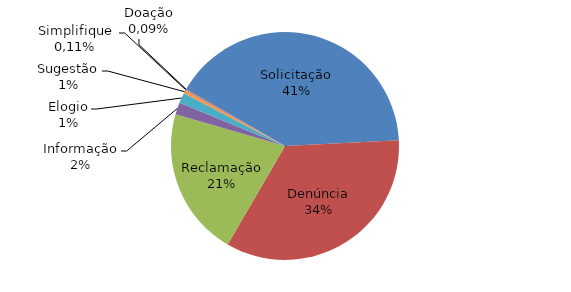
| Category | Series 0 |
|---|---|
| Solicitação | 4256 |
| Denúncia | 3564 |
| Reclamação | 2199 |
| Informação | 176 |
| Elogio | 152 |
| Sugestão | 52 |
| Simplifique | 11 |
| Doação | 9 |